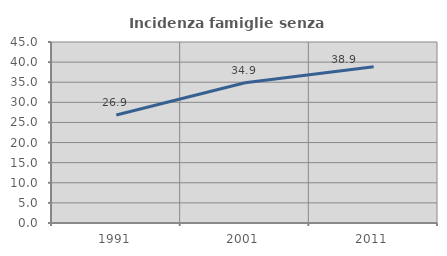
| Category | Incidenza famiglie senza nuclei |
|---|---|
| 1991.0 | 26.871 |
| 2001.0 | 34.851 |
| 2011.0 | 38.851 |